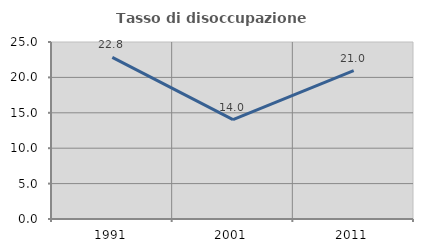
| Category | Tasso di disoccupazione giovanile  |
|---|---|
| 1991.0 | 22.818 |
| 2001.0 | 14.029 |
| 2011.0 | 20.952 |